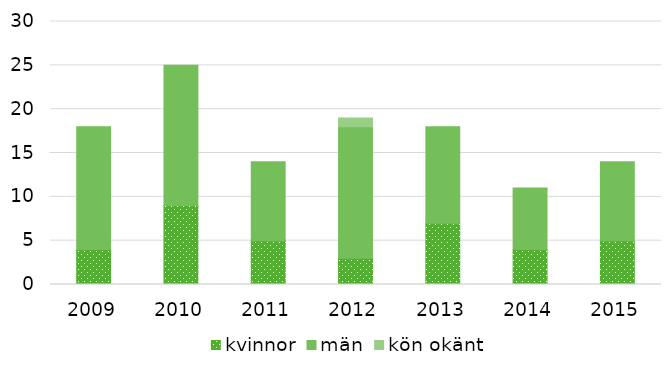
| Category | kvinnor | män | kön okänt |
|---|---|---|---|
| 2009.0 | 4 | 14 | 0 |
| 2010.0 | 9 | 16 | 0 |
| 2011.0 | 5 | 9 | 0 |
| 2012.0 | 3 | 15 | 1 |
| 2013.0 | 7 | 11 | 0 |
| 2014.0 | 4 | 7 | 0 |
| 2015.0 | 5 | 9 | 0 |